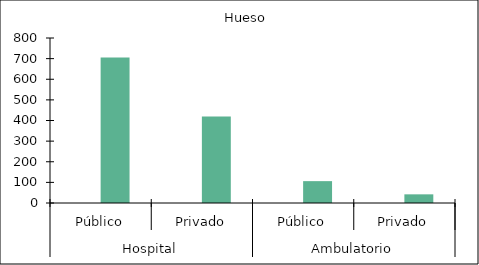
| Category |   |    Hueso |
|---|---|---|
| 0 | 0 | 706 |
| 1 | 0 | 420 |
| 2 | 0 | 106 |
| 3 | 0 | 42 |